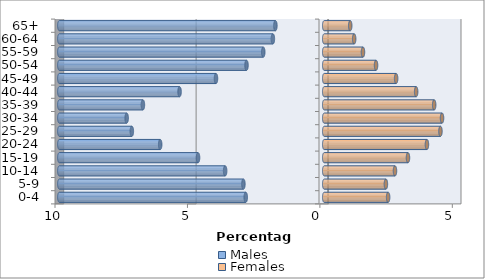
| Category | Males | Females |
|---|---|---|
| 0-4 | -2.963 | 2.413 |
| 5-9 | -3.051 | 2.329 |
| 10-14 | -3.741 | 2.671 |
| 15-19 | -4.764 | 3.162 |
| 20-24 | -6.193 | 3.878 |
| 25-29 | -7.263 | 4.388 |
| 30-34 | -7.458 | 4.448 |
| 35-39 | -6.845 | 4.151 |
| 40-44 | -5.461 | 3.471 |
| 45-49 | -4.086 | 2.715 |
| 50-54 | -2.934 | 1.956 |
| 55-59 | -2.302 | 1.463 |
| 60-64 | -1.938 | 1.131 |
| 65+ | -1.843 | 0.982 |